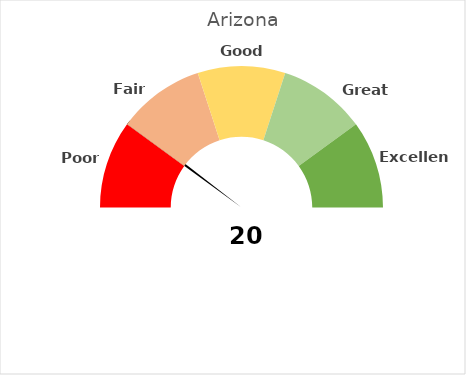
| Category | Pointer |
|---|---|
| 0 | 20 |
| 1 | 1 |
| 2 | 179 |